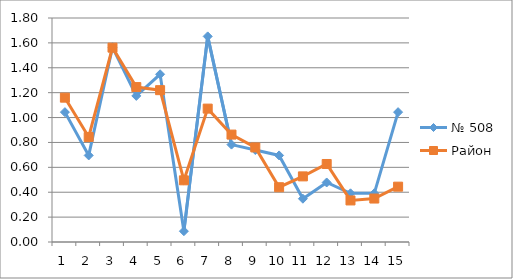
| Category | № 508 | Район |
|---|---|---|
| 0 | 1.043 | 1.16 |
| 1 | 0.696 | 0.844 |
| 2 | 1.565 | 1.562 |
| 3 | 1.174 | 1.245 |
| 4 | 1.348 | 1.22 |
| 5 | 0.087 | 0.496 |
| 6 | 1.652 | 1.072 |
| 7 | 0.783 | 0.863 |
| 8 | 0.739 | 0.76 |
| 9 | 0.696 | 0.44 |
| 10 | 0.348 | 0.527 |
| 11 | 0.478 | 0.627 |
| 12 | 0.391 | 0.334 |
| 13 | 0.391 | 0.349 |
| 14 | 1.043 | 0.445 |